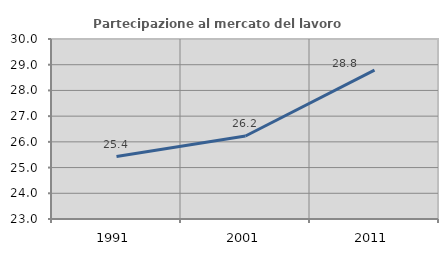
| Category | Partecipazione al mercato del lavoro  femminile |
|---|---|
| 1991.0 | 25.43 |
| 2001.0 | 26.226 |
| 2011.0 | 28.791 |